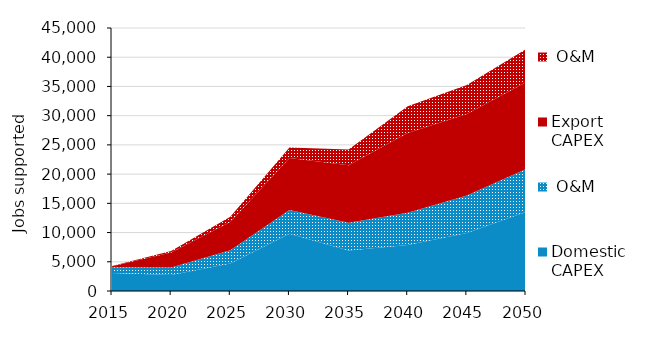
| Category | Domestic | Export |
|---|---|---|
| 2015.0 | 990.809 | 15.455 |
| 2020.0 | 1297.485 | 267.142 |
| 2025.0 | 2260.987 | 894.341 |
| 2030.0 | 4079.402 | 1815.146 |
| 2035.0 | 4750.144 | 2689.928 |
| 2040.0 | 5510.76 | 4568.74 |
| 2045.0 | 6403.117 | 4956.017 |
| 2050.0 | 7326.528 | 5647.802 |